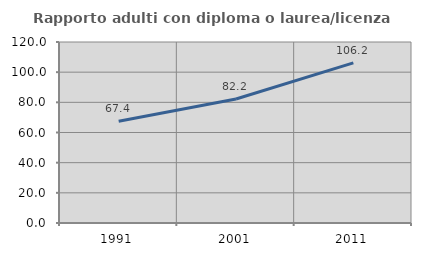
| Category | Rapporto adulti con diploma o laurea/licenza media  |
|---|---|
| 1991.0 | 67.429 |
| 2001.0 | 82.222 |
| 2011.0 | 106.182 |